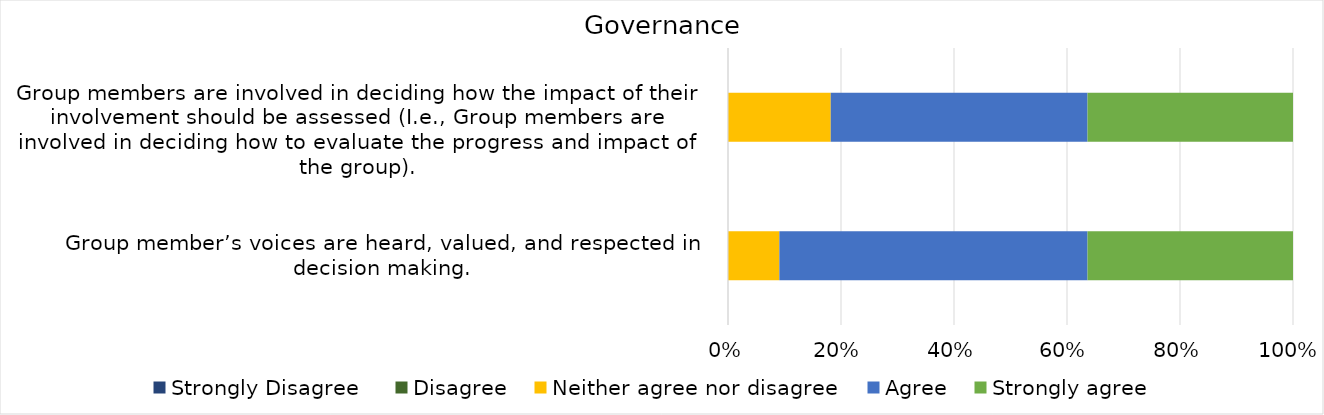
| Category | Strongly Disagree 
 | Disagree
 | Neither agree nor disagree
 | Agree
 | Strongly agree
 |
|---|---|---|---|---|---|
| Group member’s voices are heard, valued, and respected in decision making. 
 | 0 | 0 | 1 | 6 | 4 |
| 
Group members are involved in deciding how the impact of their involvement should be assessed (I.e., Group members are involved in deciding how to evaluate the progress and impact of the group). 
 | 0 | 0 | 0.182 | 0.455 | 0.364 |